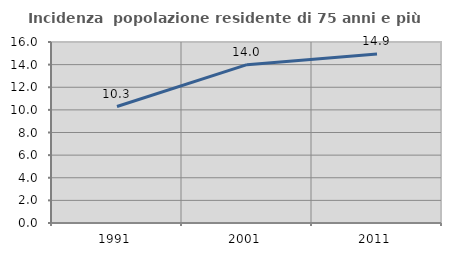
| Category | Incidenza  popolazione residente di 75 anni e più |
|---|---|
| 1991.0 | 10.295 |
| 2001.0 | 13.999 |
| 2011.0 | 14.948 |